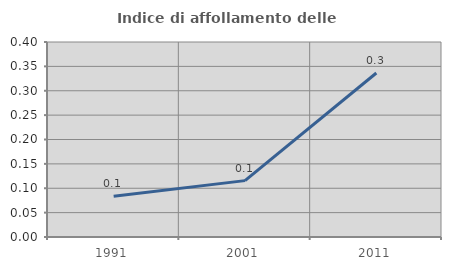
| Category | Indice di affollamento delle abitazioni  |
|---|---|
| 1991.0 | 0.083 |
| 2001.0 | 0.116 |
| 2011.0 | 0.336 |